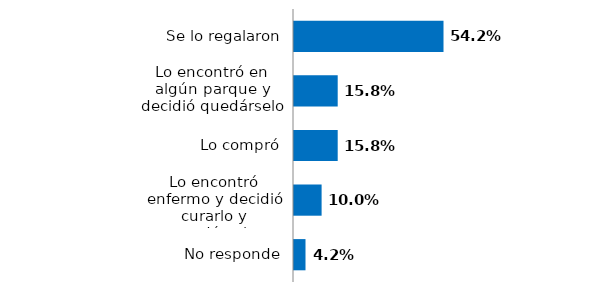
| Category | Series 0 |
|---|---|
| No responde | 0.042 |
| Lo encontró enfermo y decidió curarlo y quedárselo | 0.1 |
| Lo compró | 0.158 |
| Lo encontró en algún parque y decidió quedárselo | 0.158 |
| Se lo regalaron | 0.542 |